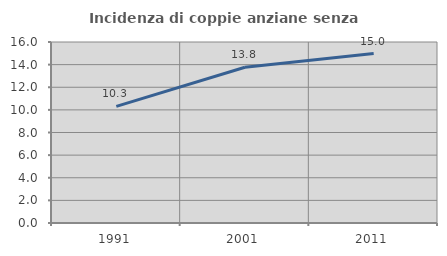
| Category | Incidenza di coppie anziane senza figli  |
|---|---|
| 1991.0 | 10.309 |
| 2001.0 | 13.766 |
| 2011.0 | 14.975 |